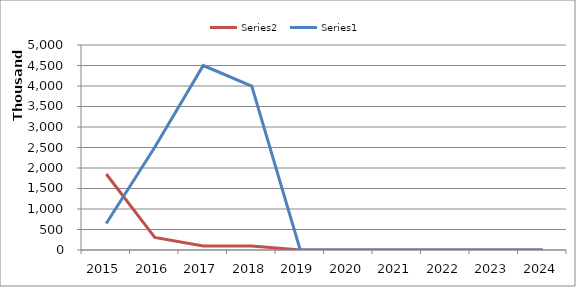
| Category | Series 1 | Series 0 |
|---|---|---|
| 2015.0 | 1852794 | 647996 |
| 2016.0 | 305448 | 2506683 |
| 2017.0 | 100000 | 4500000 |
| 2018.0 | 100000 | 4000000 |
| 2019.0 | 0 | 0 |
| 2020.0 | 0 | 0 |
| 2021.0 | 0 | 0 |
| 2022.0 | 0 | 0 |
| 2023.0 | 0 | 0 |
| 2024.0 | 0 | 0 |